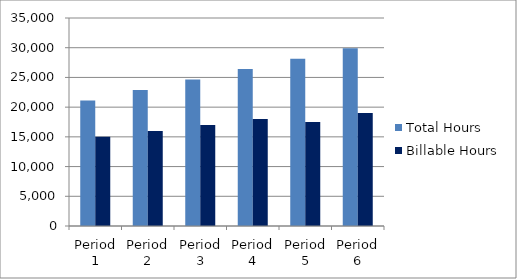
| Category | Total Hours | Billable Hours |
|---|---|---|
| Period 1 | 21120 | 15000 |
| Period 2 | 22880 | 16000 |
| Period 3 | 24640 | 17000 |
| Period 4 | 26400 | 18000 |
| Period 5 | 28160 | 17500 |
| Period 6 | 29920 | 19000 |